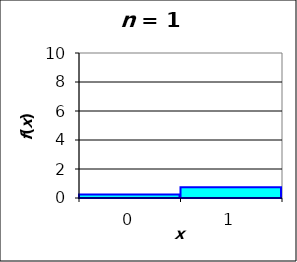
| Category | Series 0 |
|---|---|
| 0.0 | 0.25 |
| 1.0 | 0.75 |